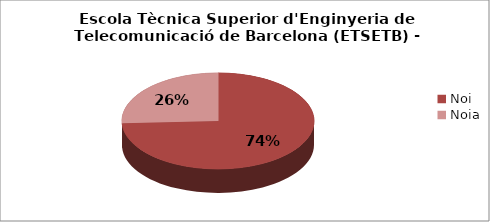
| Category | Escola Tècnica Superior d'Enginyeria de Telecomunicació de Barcelona (ETSETB) - Gènere |
|---|---|
| Noi | 0.742 |
| Noia | 0.258 |